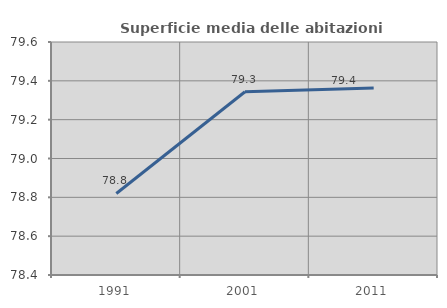
| Category | Superficie media delle abitazioni occupate |
|---|---|
| 1991.0 | 78.82 |
| 2001.0 | 79.344 |
| 2011.0 | 79.363 |